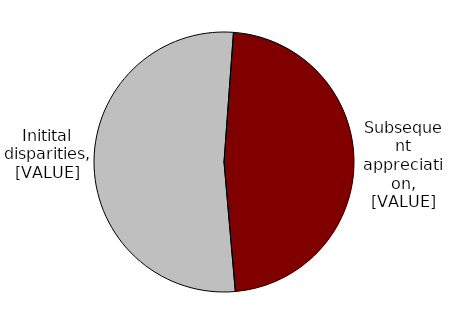
| Category | Series 0 |
|---|---|
| Initial disparities | 0.526 |
| Subsequent appreciation | 0.474 |